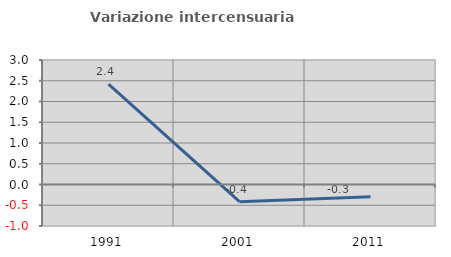
| Category | Variazione intercensuaria annua |
|---|---|
| 1991.0 | 2.418 |
| 2001.0 | -0.414 |
| 2011.0 | -0.297 |